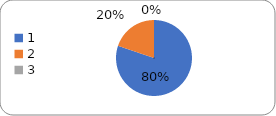
| Category | Series 0 |
|---|---|
| 0 | 81 |
| 1 | 20 |
| 2 | 0 |